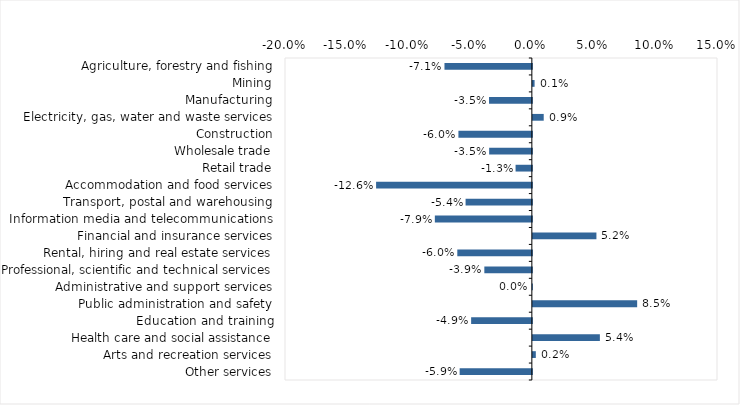
| Category | This week |
|---|---|
| Agriculture, forestry and fishing | -0.071 |
| Mining | 0.001 |
| Manufacturing | -0.035 |
| Electricity, gas, water and waste services | 0.009 |
| Construction | -0.06 |
| Wholesale trade | -0.035 |
| Retail trade | -0.013 |
| Accommodation and food services | -0.126 |
| Transport, postal and warehousing | -0.054 |
| Information media and telecommunications | -0.079 |
| Financial and insurance services | 0.052 |
| Rental, hiring and real estate services | -0.06 |
| Professional, scientific and technical services | -0.038 |
| Administrative and support services | 0 |
| Public administration and safety | 0.084 |
| Education and training | -0.049 |
| Health care and social assistance | 0.054 |
| Arts and recreation services | 0.002 |
| Other services | -0.058 |